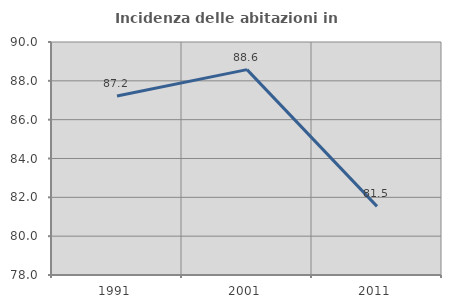
| Category | Incidenza delle abitazioni in proprietà  |
|---|---|
| 1991.0 | 87.224 |
| 2001.0 | 88.578 |
| 2011.0 | 81.535 |